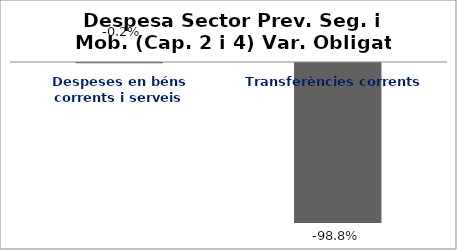
| Category | Series 0 |
|---|---|
| Despeses en béns corrents i serveis | -0.002 |
| Transferències corrents | -0.988 |